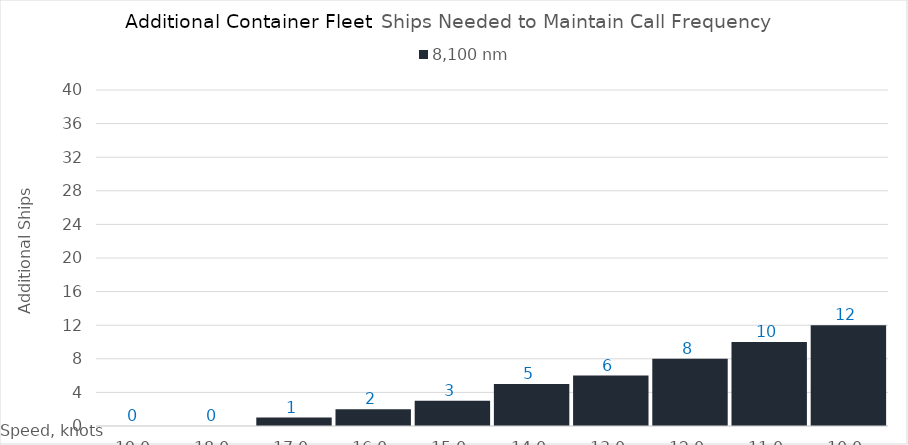
| Category | 8,100 |
|---|---|
| 19.0 | 0 |
| 18.0 | 0 |
| 17.0 | 1 |
| 16.0 | 2 |
| 15.0 | 3 |
| 14.0 | 5 |
| 13.0 | 6 |
| 12.0 | 8 |
| 11.0 | 10 |
| 10.0 | 12 |